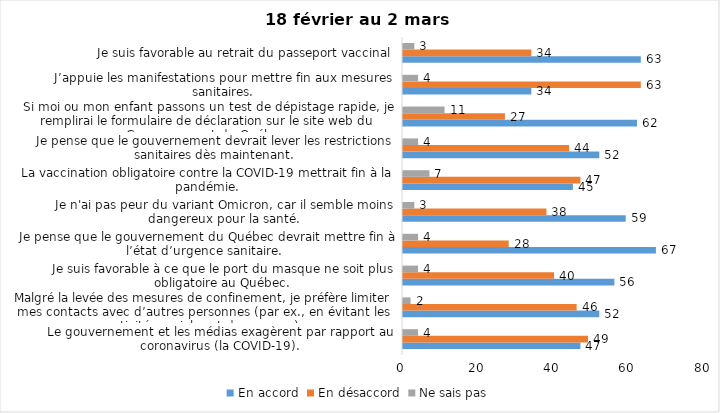
| Category | En accord | En désaccord | Ne sais pas |
|---|---|---|---|
| Le gouvernement et les médias exagèrent par rapport au coronavirus (la COVID-19). | 47 | 49 | 4 |
| Malgré la levée des mesures de confinement, je préfère limiter mes contacts avec d’autres personnes (par ex., en évitant les activités sociales et de groupes) | 52 | 46 | 2 |
| Je suis favorable à ce que le port du masque ne soit plus obligatoire au Québec. | 56 | 40 | 4 |
| Je pense que le gouvernement du Québec devrait mettre fin à l’état d’urgence sanitaire.  | 67 | 28 | 4 |
| Je n'ai pas peur du variant Omicron, car il semble moins dangereux pour la santé. | 59 | 38 | 3 |
| La vaccination obligatoire contre la COVID-19 mettrait fin à la pandémie. | 45 | 47 | 7 |
| Je pense que le gouvernement devrait lever les restrictions sanitaires dès maintenant. | 52 | 44 | 4 |
| Si moi ou mon enfant passons un test de dépistage rapide, je remplirai le formulaire de déclaration sur le site web du Gouvernement du Québec. | 62 | 27 | 11 |
| J’appuie les manifestations pour mettre fin aux mesures sanitaires. | 34 | 63 | 4 |
| Je suis favorable au retrait du passeport vaccinal | 63 | 34 | 3 |